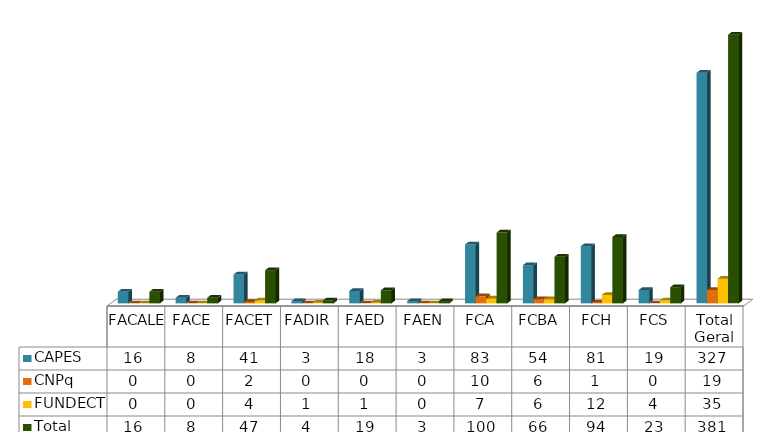
| Category | CAPES | CNPq | FUNDECT | Total |
|---|---|---|---|---|
| FACALE | 16.417 | 0 | 0 | 16.417 |
| FACE | 8 | 0 | 0 | 8 |
| FACET | 41 | 2 | 4 | 47 |
| FADIR | 3.167 | 0 | 1 | 4.167 |
| FAED | 17.583 | 0 | 1 | 18.583 |
| FAEN | 3.167 | 0 | 0 | 3.167 |
| FCA | 83.417 | 10 | 7 | 100.417 |
| FCBA | 54.083 | 6 | 6 | 66.083 |
| FCH | 81.083 | 1 | 12 | 94.083 |
| FCS | 18.917 | 0 | 4 | 22.917 |
| Total Geral | 326.833 | 19 | 35 | 380.833 |